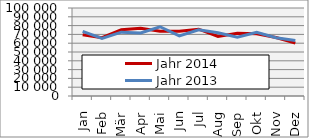
| Category | Jahr 2014 | Jahr 2013 |
|---|---|---|
| Jan | 69636.552 | 73438.737 |
| Feb | 66189.607 | 65423.211 |
| Mär | 75306.791 | 72536.498 |
| Apr | 77107.505 | 71545.91 |
| Mai | 73641.853 | 78678.088 |
| Jun | 73565.166 | 68277.211 |
| Jul | 75929.435 | 75296.179 |
| Aug | 67750.894 | 71887.766 |
| Sep | 71361.688 | 66851.926 |
| Okt | 70832.815 | 72491.749 |
| Nov | 66459.177 | 66118.876 |
| Dez | 60058.815 | 62944.849 |